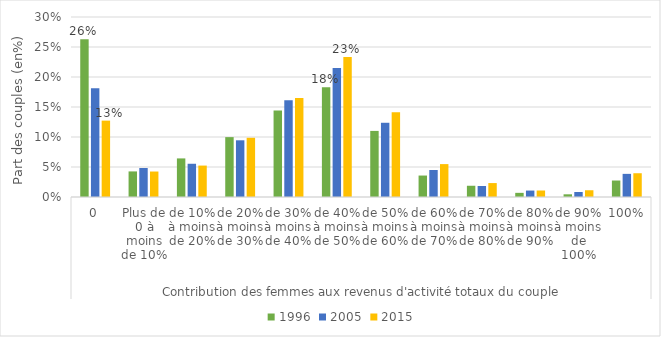
| Category | 1996 | 2005 | 2015 |
|---|---|---|---|
| 0 | 0.263 | 0.181 | 0.127 |
| 1 | 0.043 | 0.048 | 0.042 |
| 2 | 0.064 | 0.055 | 0.052 |
| 3 | 0.1 | 0.095 | 0.099 |
| 4 | 0.144 | 0.161 | 0.165 |
| 5 | 0.183 | 0.215 | 0.233 |
| 6 | 0.11 | 0.124 | 0.141 |
| 7 | 0.036 | 0.045 | 0.055 |
| 8 | 0.019 | 0.018 | 0.023 |
| 9 | 0.007 | 0.011 | 0.011 |
| 10 | 0.004 | 0.008 | 0.011 |
| 11 | 0.027 | 0.039 | 0.04 |